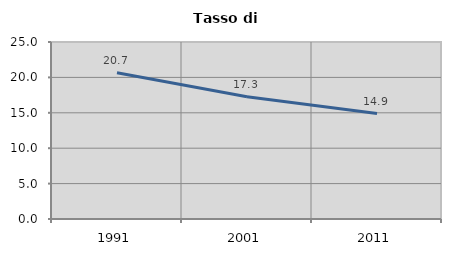
| Category | Tasso di disoccupazione   |
|---|---|
| 1991.0 | 20.657 |
| 2001.0 | 17.271 |
| 2011.0 | 14.888 |